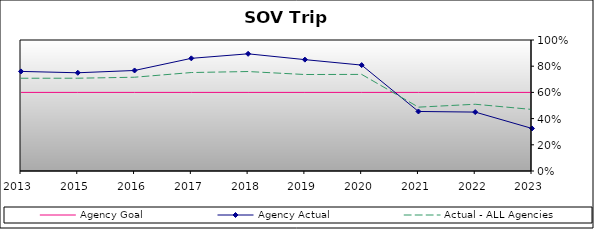
| Category | Agency Goal | Agency Actual | Actual - ALL Agencies |
|---|---|---|---|
| 2013.0 | 0.6 | 0.76 | 0.708 |
| 2015.0 | 0.6 | 0.75 | 0.708 |
| 2016.0 | 0.6 | 0.767 | 0.716 |
| 2017.0 | 0.6 | 0.86 | 0.752 |
| 2018.0 | 0.6 | 0.894 | 0.759 |
| 2019.0 | 0.6 | 0.85 | 0.736 |
| 2020.0 | 0.6 | 0.808 | 0.737 |
| 2021.0 | 0.6 | 0.454 | 0.487 |
| 2022.0 | 0.6 | 0.45 | 0.509 |
| 2023.0 | 0.6 | 0.325 | 0.47 |